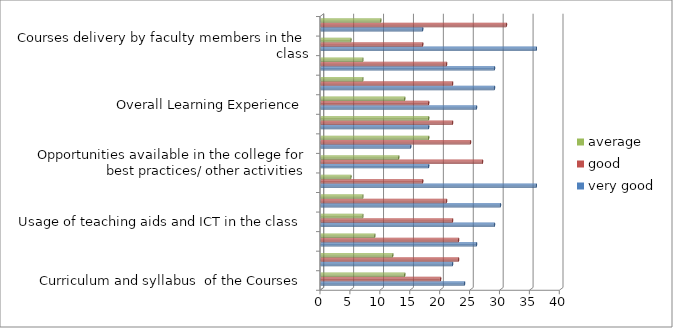
| Category | very good | good | average |
|---|---|---|---|
| Curriculum and syllabus  of the Courses | 24 | 20 | 14 |
| Extent of syllabus covered in the class | 22 | 23 | 12 |
| Courses delivery by faculty members in the class | 26 | 23 | 9 |
| Usage of teaching aids and ICT in the class | 29 | 22 | 7 |
| Fairness in the assessment Process | 30 | 21 | 7 |
| Timely announcement on internal examination time table | 36 | 17 | 5 |
| Opportunities available in the college for best practices/ other activities | 18 | 27 | 13 |
| Opportunities available in the college for students to participate in internship, field visits etc. | 15 | 25 | 18 |
| Opportunities for out of class room learning eg. Guest lectures, Seminars, Workshop Value aided Programmes, Conferences, competitions etc. | 18 | 22 | 18 |
| Overall Learning Experience | 26 | 18 | 14 |
| Curriculum and syllabus  of the Courses | 29 | 22 | 7 |
| Extent of syllabus covered in the class | 29 | 21 | 7 |
| Courses delivery by faculty members in the class | 36 | 17 | 5 |
| Usage of teaching aids and ICT in the class | 17 | 31 | 10 |